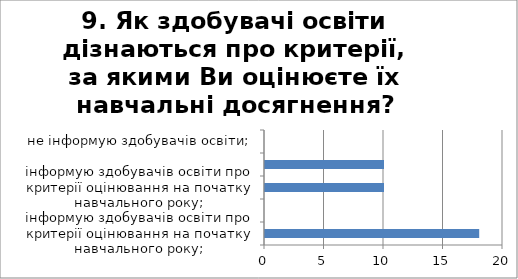
| Category | 9. Як здобувачі освіти дізнаються про критерії, за якими Ви оцінюєте їх навчальні досягнення? |
|---|---|
| інформую здобувачів освіти про критерії оцінювання на початку навчального року; | 18 |
| розміщую критерії оцінювання на веб-сайті або інтерактивній платформі  закладу освіти; | 0 |
| інформую здобувачів освіти про критерії оцінювання на початку навчального року; | 10 |
| пояснюю здобувачів освіти індивідуально. | 10 |
| не інформую здобувачів освіти; | 0 |